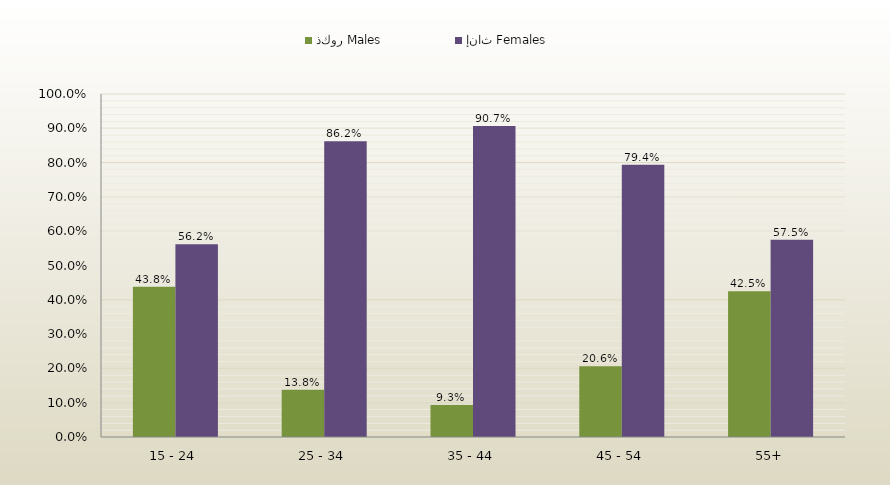
| Category | ذكور Males | إناث Females |
|---|---|---|
| 15 - 24 | 0.438 | 0.562 |
| 25 - 34 | 0.138 | 0.862 |
| 35 - 44 | 0.093 | 0.907 |
| 45 - 54 | 0.206 | 0.794 |
| 55+ | 0.425 | 0.575 |